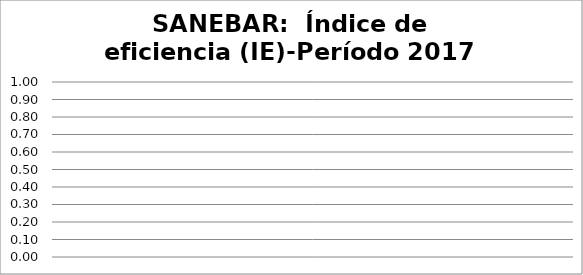
| Category | Índice de eficiencia (IE)  |
|---|---|
| 0 | 0 |